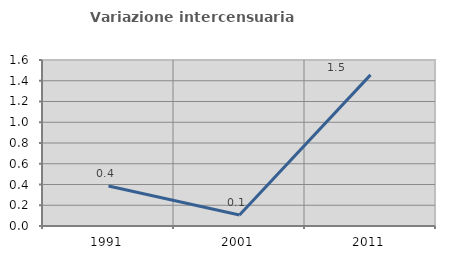
| Category | Variazione intercensuaria annua |
|---|---|
| 1991.0 | 0.386 |
| 2001.0 | 0.105 |
| 2011.0 | 1.456 |